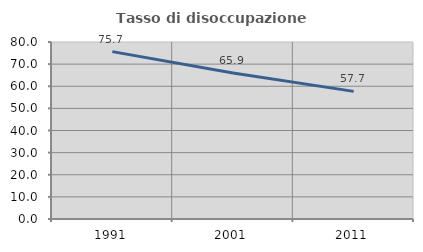
| Category | Tasso di disoccupazione giovanile  |
|---|---|
| 1991.0 | 75.656 |
| 2001.0 | 65.946 |
| 2011.0 | 57.679 |